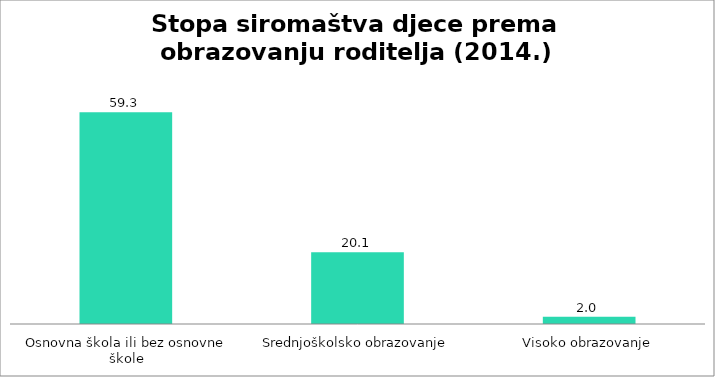
| Category | Stopa |
|---|---|
| Osnovna škola ili bez osnovne škole | 59.3 |
| Srednjoškolsko obrazovanje | 20.1 |
| Visoko obrazovanje | 2 |